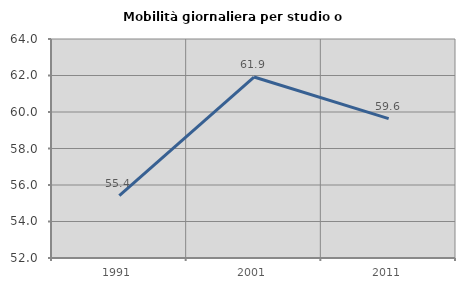
| Category | Mobilità giornaliera per studio o lavoro |
|---|---|
| 1991.0 | 55.422 |
| 2001.0 | 61.918 |
| 2011.0 | 59.636 |